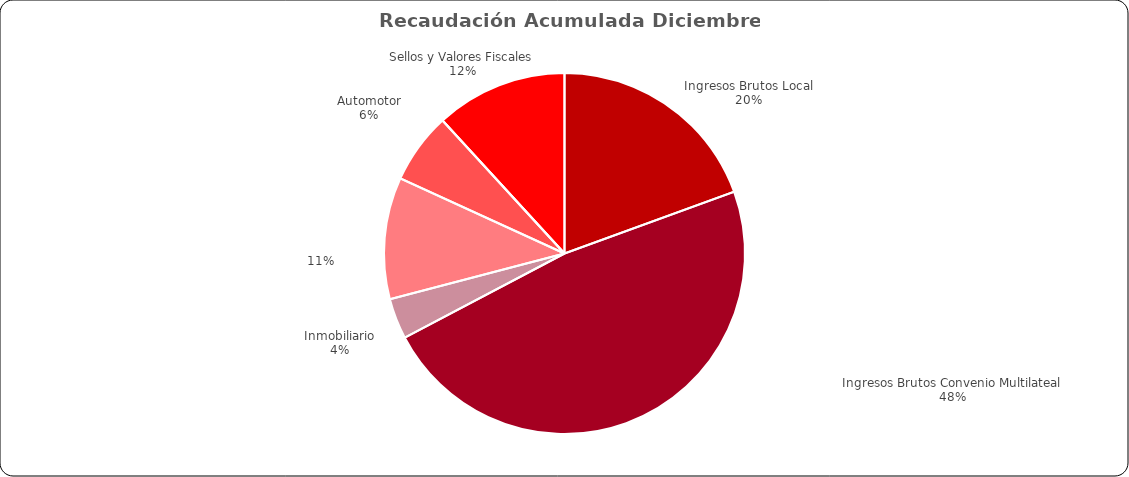
| Category | Recaudación
 Acumulada hasta
Diciembre 2022 |
|---|---|
| Ingresos Brutos Local | 6493174743.34 |
| Ingresos Brutos Convenio Multilateal | 15983540257.88 |
|  Inmobiliario  | 1216061926.23 |
| Automotor | 3641577253.53 |
|  Sellos y Valores Fiscales  | 2124519415.55 |
| Depositos Judiciales | 2787477.93 |
| Otros Ingresos | 3943911904.46 |